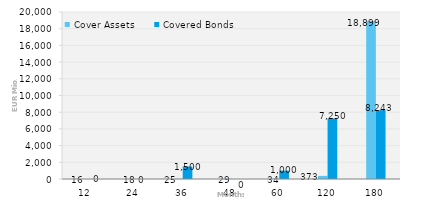
| Category | Cover Assets | Covered Bonds |
|---|---|---|
| 12.0 | 15.794 | 0 |
| 24.0 | 18.355 | 0 |
| 36.0 | 24.716 | 1500 |
| 48.0 | 28.962 | 0 |
| 60.0 | 33.658 | 1000 |
| 120.0 | 372.905 | 7250 |
| 180.0 | 18898.676 | 8243 |